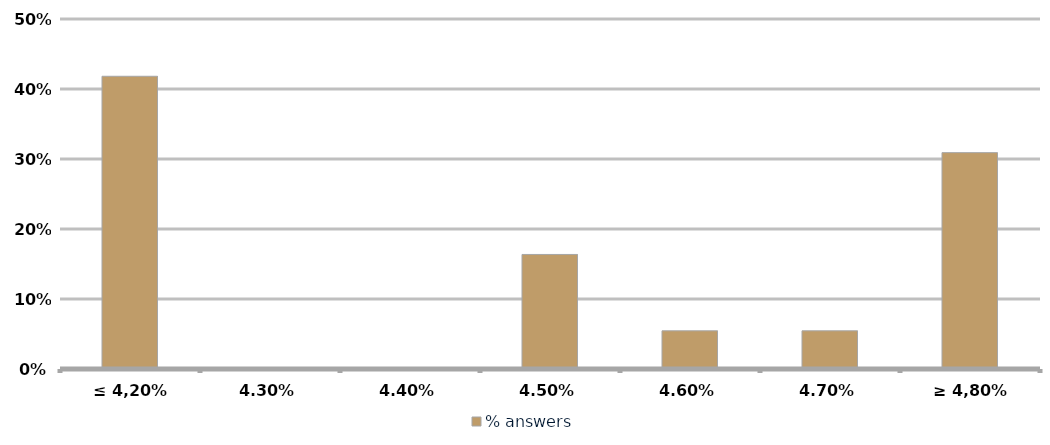
| Category | % answers |
|---|---|
| ≤ 4,20% | 0.418 |
| 4,30% | 0 |
| 4,40% | 0 |
| 4,50% | 0.164 |
| 4,60% | 0.055 |
| 4,70% | 0.055 |
| ≥ 4,80% | 0.309 |